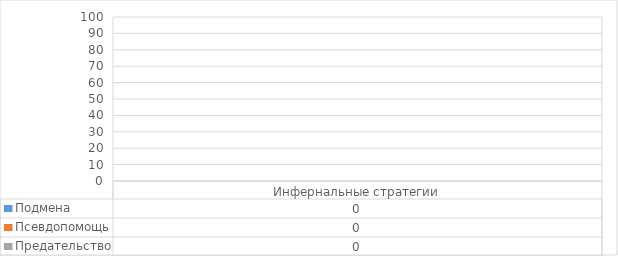
| Category | Подмена | Псевдопомощь | Предательство |
|---|---|---|---|
| 0 | 0 | 0 | 0 |